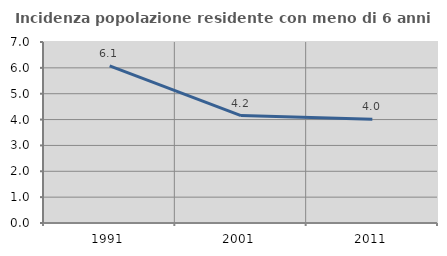
| Category | Incidenza popolazione residente con meno di 6 anni |
|---|---|
| 1991.0 | 6.078 |
| 2001.0 | 4.156 |
| 2011.0 | 4.011 |